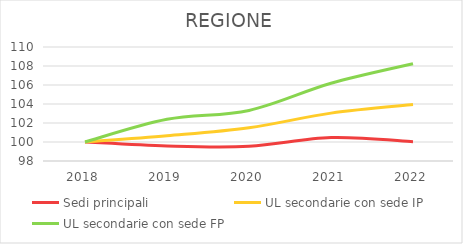
| Category | Sedi principali | UL secondarie con sede IP | UL secondarie con sede FP |
|---|---|---|---|
| 2018.0 | 100 | 100 | 100 |
| 2019.0 | 99.58 | 100.656 | 102.386 |
| 2020.0 | 99.547 | 101.499 | 103.324 |
| 2021.0 | 100.461 | 103.04 | 106.185 |
| 2022.0 | 100.033 | 103.941 | 108.243 |